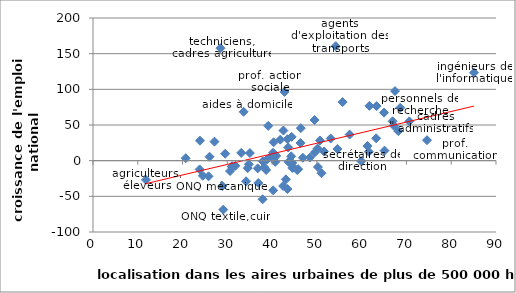
| Category | Series 0 |
|---|---|
| 11.824202039388368 | -26.886 |
| 26.027884969828463 | 5.502 |
| 28.48104454127098 | 157.692 |
| 23.885084173261895 | 28 |
| 34.80721686847081 | -5.102 |
| 38.675125498481194 | -13.084 |
| 33.10550354348826 | 10.914 |
| 38.26124862999109 | -9.272 |
| 38.83185821128548 | 1.533 |
| 29.517653153970514 | 9.722 |
| 44.36429784376024 | 33.333 |
| 67.45083489596432 | 97.59 |
| 34.179905346214184 | -28.889 |
| 40.24260958796335 | -41.667 |
| 50.23726138808389 | -8.917 |
| 24.51828841449063 | -21.154 |
| 25.80651701430564 | -21.97 |
| 31.0009667072178 | -8.485 |
| 28.903053813123357 | -35.622 |
| 30.601678276935885 | -14.545 |
| 43.67402487791763 | -1.681 |
| 23.81733393060788 | -12.264 |
| 31.062347382938842 | -7.669 |
| 35.03394353748839 | 10.648 |
| 29.089190745178477 | -68.657 |
| 37.87867149611501 | -54.167 |
| 20.71301302731441 | 3.448 |
| 27.128467126600057 | 26.667 |
| 43.42186036462149 | -39.785 |
| 44.49666299676142 | -3.125 |
| 36.91133641268328 | -31.317 |
| 34.559018066529795 | -10.396 |
| 50.68599806826043 | 28.375 |
| 61.729927709314715 | 76.774 |
| 44.73729043454495 | -9.184 |
| 40.20566947214255 | 11.111 |
| 40.911090095496924 | 6.759 |
| 54.21645848223616 | 160.465 |
| 63.245820107292296 | 31.333 |
| 64.99239952928713 | 67.308 |
| 36.78436633990984 | -10.833 |
| 43.0768289249653 | -26.199 |
| 45.612866820055736 | -13.187 |
| 53.090588782233674 | 31.095 |
| 59.89459510042591 | -0.625 |
| 55.73751176960244 | 82.11 |
| 70.64355852967381 | 55.122 |
| 46.860827395845774 | 4.11 |
| 61.59773110676912 | 12.5 |
| 61.31265881074778 | 20.588 |
| 85.08587847284443 | 123.27 |
| 68.60554998513774 | 74.091 |
| 44.51458186658376 | -10.247 |
| 48.43164624008961 | 4.337 |
| 57.31367206725735 | 36.585 |
| 63.3311271542903 | 76.471 |
| 42.46624359868656 | -35.533 |
| 51.023519359164695 | -17.59 |
| 54.58259916655622 | 16.364 |
| 68.19352003415965 | 41.398 |
| 40.70400889503977 | -1.672 |
| 43.60171119624304 | 18.503 |
| 51.59160053220631 | 12.931 |
| 44.11275244711377 | -2.669 |
| 67.1935226192255 | 48.883 |
| 31.78763201559958 | -7.308 |
| 46.33152708956352 | 24.742 |
| 50.147194858679555 | 17.035 |
| 37.93005769997775 | -0.935 |
| 40.33126641203631 | 25.749 |
| 45.81628359582386 | -11.858 |
| 33.630329322024615 | 68.553 |
| 42.52840910752331 | 42.249 |
| 65.10878996954061 | 14.062 |
| 39.962714880887184 | 6.828 |
| 74.5898596121997 | 28.689 |
| 66.91249224189878 | 55.159 |
| 39.121750236925116 | 48.756 |
| 41.83748532623606 | 29.452 |
| 49.55552982322094 | 11.73 |
| 46.4146418045158 | 45.578 |
| 42.76404685889108 | 96.341 |
| 43.438279882887656 | 30.104 |
| 44.26921057213683 | 6.106 |
| 49.481739374082004 | 56.989 |